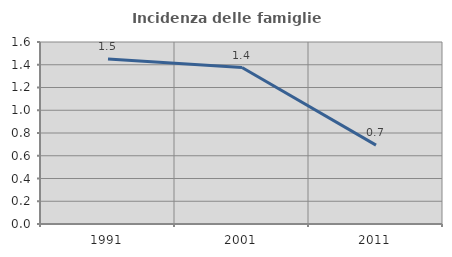
| Category | Incidenza delle famiglie numerose |
|---|---|
| 1991.0 | 1.451 |
| 2001.0 | 1.376 |
| 2011.0 | 0.693 |